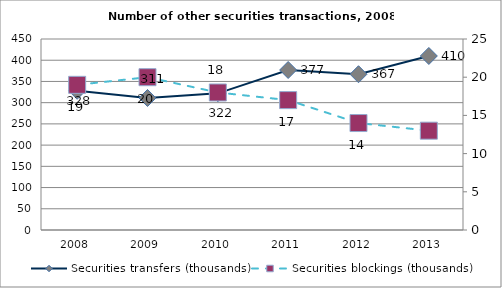
| Category | Securities transfers (thousands) |
|---|---|
| 2008.0 | 328 |
| 2009.0 | 311 |
| 2010.0 | 322 |
| 2011.0 | 377 |
| 2012.0 | 367 |
| 2013.0 | 410 |